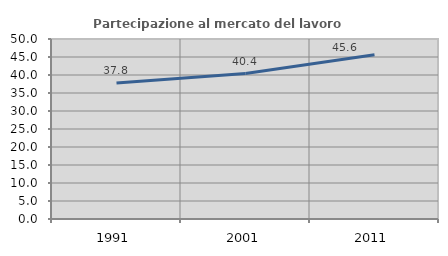
| Category | Partecipazione al mercato del lavoro  femminile |
|---|---|
| 1991.0 | 37.789 |
| 2001.0 | 40.411 |
| 2011.0 | 45.648 |